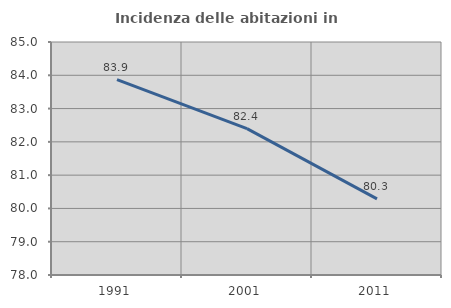
| Category | Incidenza delle abitazioni in proprietà  |
|---|---|
| 1991.0 | 83.871 |
| 2001.0 | 82.398 |
| 2011.0 | 80.287 |